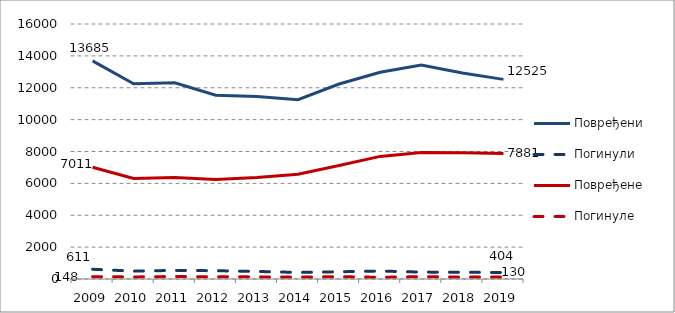
| Category | Повређени | Погинули | Повређене | Погинуле |
|---|---|---|---|---|
| 2009 | 13685 | 611 | 7011 | 148 |
| 2010 | 12249 | 494 | 6313 | 129 |
| 2011 | 12315 | 540 | 6376 | 157 |
| 2012 | 11535 | 520 | 6243 | 136 |
| 2013 | 11447 | 474 | 6362 | 134 |
| 2014 | 11248 | 413 | 6579 | 118 |
| 2015 | 12235 | 454 | 7119 | 145 |
| 2016 | 12969 | 499 | 7692 | 108 |
| 2017 | 13422 | 433 | 7939 | 146 |
| 2018 | 12930 | 425 | 7921 | 123 |
| 2019 | 12525 | 404 | 7881 | 130 |